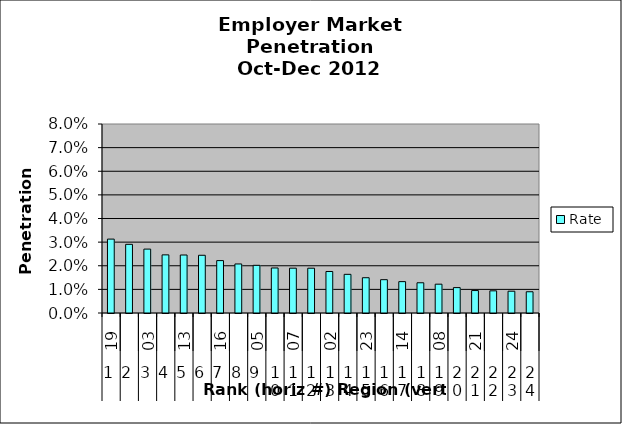
| Category | Rate |
|---|---|
| 0 | 0.031 |
| 1 | 0.029 |
| 2 | 0.027 |
| 3 | 0.025 |
| 4 | 0.025 |
| 5 | 0.024 |
| 6 | 0.022 |
| 7 | 0.021 |
| 8 | 0.02 |
| 9 | 0.019 |
| 10 | 0.019 |
| 11 | 0.019 |
| 12 | 0.018 |
| 13 | 0.016 |
| 14 | 0.015 |
| 15 | 0.014 |
| 16 | 0.013 |
| 17 | 0.013 |
| 18 | 0.012 |
| 19 | 0.011 |
| 20 | 0.009 |
| 21 | 0.009 |
| 22 | 0.009 |
| 23 | 0.009 |